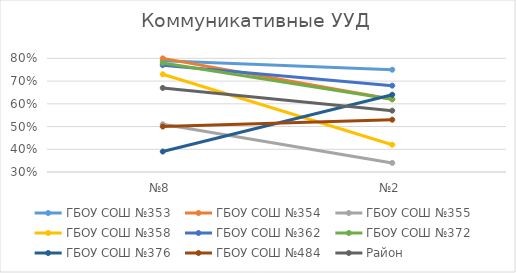
| Category | ГБОУ СОШ №353 | ГБОУ СОШ №354 | ГБОУ СОШ №355 | ГБОУ СОШ №358  | ГБОУ СОШ №362 | ГБОУ СОШ №372 | ГБОУ СОШ №376 | ГБОУ СОШ №484 | Район |
|---|---|---|---|---|---|---|---|---|---|
| №8 | 0.79 | 0.8 | 0.51 | 0.73 | 0.77 | 0.78 | 0.39 | 0.5 | 0.67 |
| №2 | 0.75 | 0.62 | 0.34 | 0.42 | 0.68 | 0.62 | 0.64 | 0.53 | 0.57 |